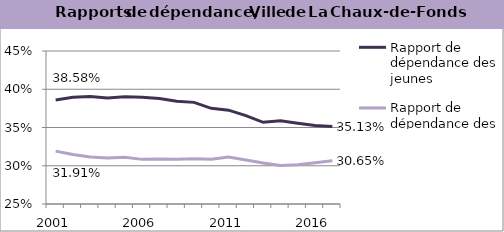
| Category | Rapport de dépendance des jeunes | Rapport de dépendance des personnes âgées |
|---|---|---|
| 2001.0 | 0.386 | 0.319 |
| 2002.0 | 0.39 | 0.315 |
| 2003.0 | 0.39 | 0.311 |
| 2004.0 | 0.389 | 0.31 |
| 2005.0 | 0.39 | 0.311 |
| 2006.0 | 0.39 | 0.308 |
| 2007.0 | 0.388 | 0.309 |
| 2008.0 | 0.384 | 0.308 |
| 2009.0 | 0.383 | 0.309 |
| 2010.0 | 0.375 | 0.308 |
| 2011.0 | 0.373 | 0.311 |
| 2012.0 | 0.366 | 0.308 |
| 2013.0 | 0.357 | 0.304 |
| 2014.0 | 0.359 | 0.3 |
| 2015.0 | 0.355 | 0.301 |
| 2016.0 | 0.353 | 0.304 |
| 2017.0 | 0.351 | 0.307 |